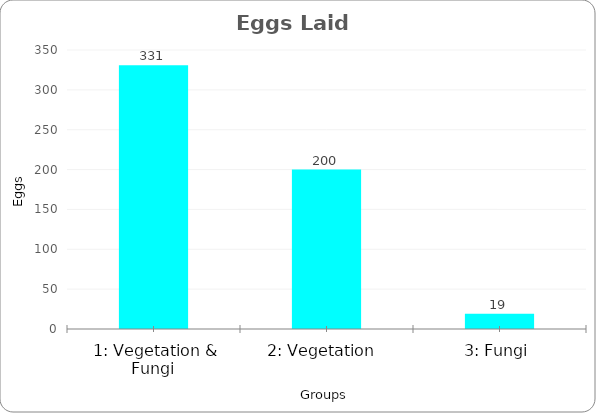
| Category | Series 0 |
|---|---|
|  1: Vegetation & Fungi | 331 |
| 2: Vegetation  | 200 |
| 3: Fungi | 19 |